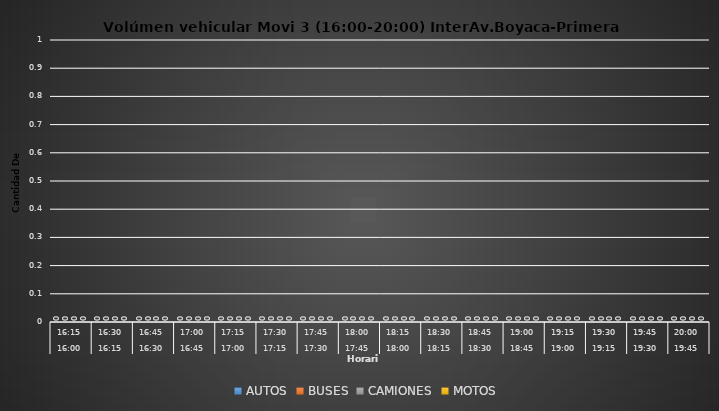
| Category | AUTOS | BUSES | CAMIONES | MOTOS |
|---|---|---|---|---|
| 0 | 0 | 0 | 0 | 0 |
| 1 | 0 | 0 | 0 | 0 |
| 2 | 0 | 0 | 0 | 0 |
| 3 | 0 | 0 | 0 | 0 |
| 4 | 0 | 0 | 0 | 0 |
| 5 | 0 | 0 | 0 | 0 |
| 6 | 0 | 0 | 0 | 0 |
| 7 | 0 | 0 | 0 | 0 |
| 8 | 0 | 0 | 0 | 0 |
| 9 | 0 | 0 | 0 | 0 |
| 10 | 0 | 0 | 0 | 0 |
| 11 | 0 | 0 | 0 | 0 |
| 12 | 0 | 0 | 0 | 0 |
| 13 | 0 | 0 | 0 | 0 |
| 14 | 0 | 0 | 0 | 0 |
| 15 | 0 | 0 | 0 | 0 |